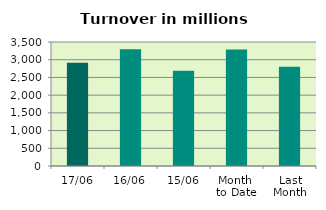
| Category | Series 0 |
|---|---|
| 17/06 | 2914.445 |
| 16/06 | 3298.496 |
| 15/06 | 2686.876 |
| Month 
to Date | 3284.898 |
| Last
Month | 2802.964 |